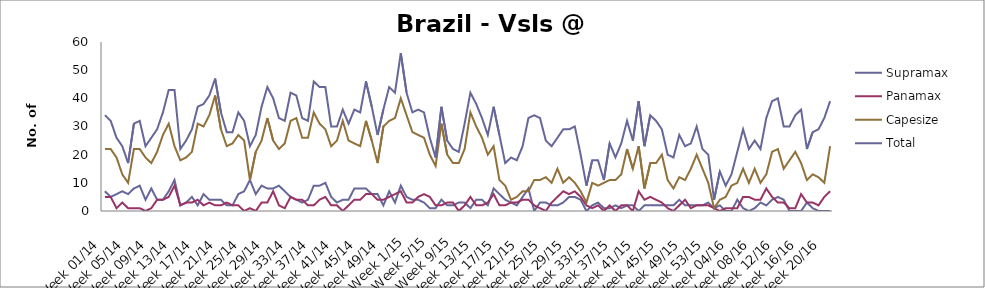
| Category | Supramax | Panamax | Capesize | Total |
|---|---|---|---|---|
| Week 01/14 | 7 | 5 | 22 | 34 |
| Week 02/14 | 5 | 5 | 22 | 32 |
| Week 03/14 | 6 | 1 | 19 | 26 |
| Week 04/14 | 7 | 3 | 13 | 23 |
| Week 05/14 | 6 | 1 | 10 | 17 |
| Week 06/14 | 8 | 1 | 22 | 31 |
| Week 07/14 | 9 | 1 | 22 | 32 |
| Week 08/14 | 4 | 0 | 19 | 23 |
| Week 09/14 | 8 | 1 | 17 | 26 |
| Week 10/14 | 4 | 4 | 21 | 29 |
| Week 11/14 | 4 | 4 | 27 | 35 |
| Week 12/14 | 7 | 5 | 31 | 43 |
| Week 13/14 | 11 | 9 | 23 | 43 |
| Week 14/14 | 2 | 2 | 18 | 22 |
| Week 15/14 | 3 | 3 | 19 | 25 |
| Week 16/14 | 5 | 3 | 21 | 29 |
| Week 17/14 | 2 | 4 | 31 | 37 |
| Week 18/14 | 6 | 2 | 30 | 38 |
| Week 19/14 | 4 | 3 | 34 | 41 |
| Week 20/14 | 4 | 2 | 41 | 47 |
| Week 21/14 | 4 | 2 | 29 | 35 |
| Week 22/14 | 2 | 3 | 23 | 28 |
| Week 23/14 | 2 | 2 | 24 | 28 |
| Week 24/14 | 6 | 2 | 27 | 35 |
| Week 25/14 | 7 | 0 | 25 | 32 |
| Week 26/14 | 11 | 1 | 11 | 23 |
| Week 27/14 | 6 | 0 | 21 | 27 |
| Week 28/14 | 9 | 3 | 25 | 37 |
| Week 29/14 | 8 | 3 | 33 | 44 |
| Week 30/14 | 8 | 7 | 25 | 40 |
| Week 31/14 | 9 | 2 | 22 | 33 |
| Week 32/14 | 7 | 1 | 24 | 32 |
| Week 33/14 | 5 | 5 | 32 | 42 |
| Week 34/14 | 4 | 4 | 33 | 41 |
| Week 35/14 | 3 | 4 | 26 | 33 |
| Week 36/14 | 4 | 2 | 26 | 32 |
| Week 37/14 | 9 | 2 | 35 | 46 |
| Week 38/14 | 9 | 4 | 31 | 44 |
| Week 39/14 | 10 | 5 | 29 | 44 |
| Week 40/14 | 5 | 2 | 23 | 30 |
| Week 41/14 | 3 | 2 | 25 | 30 |
| Week 42/14 | 4 | 0 | 32 | 36 |
| Week 43/14 | 4 | 2 | 25 | 31 |
| Week 44/14 | 8 | 4 | 24 | 36 |
| Week 45/14 | 8 | 4 | 23 | 35 |
| Week 46/14 | 8 | 6 | 32 | 46 |
| Week 47/14 | 6 | 6 | 25 | 37 |
| Week 48/14 | 6 | 4 | 17 | 27 |
| Week 49/14 | 2 | 4 | 30 | 36 |
| Week 50/14 | 7 | 5 | 32 | 44 |
| Week 51/14 | 3 | 6 | 33 | 42 |
| Week 52/14 | 9 | 7 | 40 | 56 |
| Week 1/15 | 5 | 3 | 34 | 42 |
| Week 2/15 | 4 | 3 | 28 | 35 |
| Week 3/15 | 4 | 5 | 27 | 36 |
| Week 4/15 | 3 | 6 | 26 | 35 |
| Week 5/15 | 1 | 5 | 20 | 26 |
| Week 6/15 | 1 | 2 | 16 | 19 |
| Week 7/15 | 4 | 2 | 31 | 37 |
| Week 8/15 | 2 | 3 | 20 | 25 |
| Week 9/15 | 2 | 3 | 17 | 22 |
| Week 10/15 | 3 | 0 | 17 | 21 |
| Week 11/15 | 3 | 2 | 22 | 31 |
| Week 12/15 | 1 | 5 | 35 | 42 |
| Week 13/15 | 4 | 2 | 30 | 38 |
| Week 14/15 | 4 | 2 | 26 | 33 |
| Week 15/15 | 2 | 3 | 20 | 27 |
| Week 16/15 | 8 | 6 | 23 | 37 |
| Week 17/15 | 6 | 2 | 11 | 27 |
| Week 18/15 | 4 | 2 | 9 | 17 |
| Week 19/15 | 3 | 3 | 4 | 19 |
| Week 20/15 | 2 | 3 | 5 | 18 |
| Week 21/15 | 5 | 4 | 7 | 23 |
| Week 22/15 | 8 | 4 | 7 | 33 |
| Week 23/15 | 0 | 2 | 11 | 34 |
| Week 24/15 | 3 | 1 | 11 | 33 |
| Week 25/15 | 3 | 0 | 12 | 25 |
| Week 26/15 | 2 | 3 | 10 | 23 |
| Week 27/15 | 2 | 5 | 15 | 26 |
| Week 28/15 | 3 | 7 | 10 | 29 |
| Week 29/15 | 5 | 6 | 12 | 29 |
| Week 30/15 | 5 | 7 | 10 | 30 |
| Week 31/15 | 4 | 5 | 7 | 20 |
| Week 32/15 | 0 | 2 | 3 | 9 |
| Week 33/15 | 2 | 1 | 10 | 18 |
| Week 34/15 | 3 | 2 | 9 | 18 |
| Week 35/15 | 1 | 0 | 10 | 11 |
| Week 36/15 | 1 | 2 | 11 | 24 |
| Week 37/15 | 2 | 0 | 11 | 19 |
| Week 38/15 | 1 | 2 | 13 | 24 |
| Week 39/15 | 2 | 2 | 22 | 32 |
| Week 40/15 | 2 | 0 | 15 | 25 |
| Week 41/15 | 0 | 7 | 23 | 39 |
| Week 42/15 | 2 | 4 | 8 | 23 |
| Week 43/15 | 2 | 5 | 17 | 34 |
| Week 44/15 | 2 | 4 | 17 | 32 |
| Week 45/15 | 2 | 3 | 20 | 29 |
| Week 46/15 | 2 | 1 | 11 | 20 |
| Week 47/15 | 2 | 0 | 8 | 19 |
| Week 48/15 | 4 | 2 | 12 | 27 |
| Week 49/15 | 2 | 4 | 11 | 23 |
| Week 50/15 | 2 | 1 | 15 | 24 |
| Week 51/15 | 2 | 2 | 20 | 30 |
| Week 52/15 | 2 | 2 | 15 | 22 |
| Week 53/15 | 3 | 2 | 10 | 20 |
| Week 01/16 | 1 | 1 | 1 | 4 |
| Week 02/16 | 2 | 0 | 4 | 14 |
| Week 03/16 | 0 | 1 | 5 | 9 |
| Week 04/16 | 0 | 1 | 9 | 13 |
| Week 05/16 | 4 | 1 | 10 | 21 |
| Week 06/16 | 1 | 5 | 15 | 29 |
| Week 07/16 | 0 | 5 | 10 | 22 |
| Week 08/16 | 1 | 4 | 15 | 25 |
| Week 09/16 | 3 | 4 | 10 | 22 |
| Week 10/16 | 2 | 8 | 13 | 33 |
| Week 11/16 | 4 | 5 | 21 | 39 |
| Week 12/16 | 5 | 3 | 22 | 40 |
| Week 13/16 | 4 | 3 | 15 | 30 |
| Week 14/16 | 0 | 1 | 18 | 30 |
| Week 15/16 | 0 | 1 | 21 | 34 |
| Week 16/16 | 0 | 6 | 17 | 36 |
| Week 17/16 | 3 | 3 | 11 | 22 |
| Week 18/16 | 1 | 3 | 13 | 28 |
| Week 19/16 | 0 | 2 | 12 | 29 |
| Week 20/16 | 0 | 5 | 10 | 33 |
| Week 21/16 | 0 | 7 | 23 | 39 |